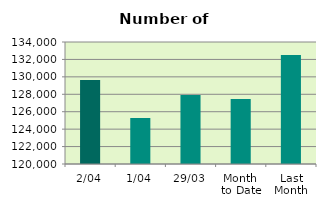
| Category | Series 0 |
|---|---|
| 2/04 | 129646 |
| 1/04 | 125290 |
| 29/03 | 127912 |
| Month 
to Date | 127468 |
| Last
Month | 132498.571 |